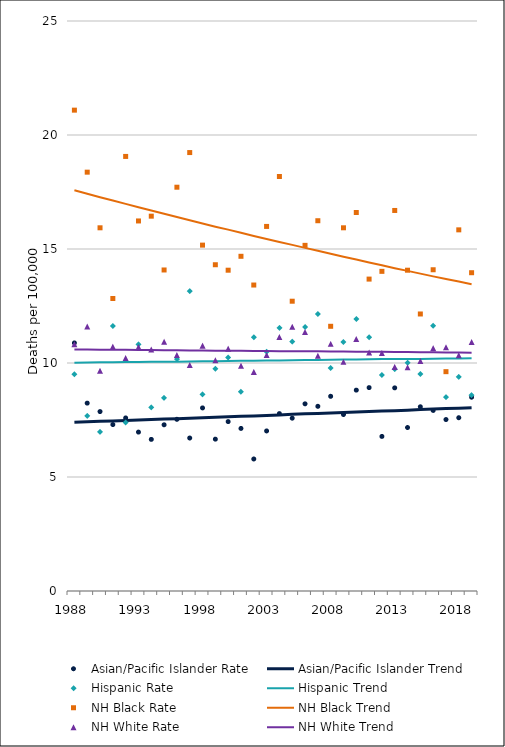
| Category | Asian/Pacific Islander Rate | Asian/Pacific Islander Trend | Hispanic Rate | Hispanic Trend | NH Black Rate | NH Black Trend | NH White Rate | NH White Trend |
|---|---|---|---|---|---|---|---|---|
| 1988.0 | 10.88 | 7.4 | 9.51 | 10.01 | 21.09 | 17.58 | 10.82 | 10.59 |
| 1989.0 | 8.24 | 7.42 | 7.68 | 10.02 | 18.37 | 17.42 | 11.6 | 10.59 |
| 1990.0 | 7.87 | 7.44 | 6.98 | 10.03 | 15.93 | 17.27 | 9.66 | 10.58 |
| 1991.0 | 7.3 | 7.46 | 11.62 | 10.03 | 12.83 | 17.13 | 10.72 | 10.58 |
| 1992.0 | 7.59 | 7.48 | 7.39 | 10.04 | 19.06 | 16.98 | 10.22 | 10.58 |
| 1993.0 | 6.97 | 7.5 | 10.82 | 10.04 | 16.23 | 16.83 | 10.7 | 10.57 |
| 1994.0 | 6.65 | 7.52 | 8.05 | 10.05 | 16.44 | 16.69 | 10.59 | 10.57 |
| 1995.0 | 7.29 | 7.54 | 8.47 | 10.06 | 14.08 | 16.55 | 10.93 | 10.56 |
| 1996.0 | 7.53 | 7.56 | 10.17 | 10.06 | 17.71 | 16.4 | 10.35 | 10.56 |
| 1997.0 | 6.71 | 7.58 | 13.15 | 10.07 | 19.23 | 16.26 | 9.91 | 10.55 |
| 1998.0 | 8.03 | 7.6 | 8.62 | 10.08 | 15.17 | 16.12 | 10.76 | 10.55 |
| 1999.0 | 6.66 | 7.62 | 9.75 | 10.08 | 14.31 | 15.98 | 10.12 | 10.54 |
| 2000.0 | 7.43 | 7.64 | 10.24 | 10.09 | 14.07 | 15.85 | 10.63 | 10.54 |
| 2001.0 | 7.13 | 7.66 | 8.74 | 10.1 | 14.68 | 15.71 | 9.88 | 10.54 |
| 2002.0 | 5.79 | 7.68 | 11.13 | 10.1 | 13.42 | 15.57 | 9.61 | 10.53 |
| 2003.0 | 7.02 | 7.7 | 10.49 | 10.11 | 15.99 | 15.44 | 10.35 | 10.53 |
| 2004.0 | 7.78 | 7.72 | 11.54 | 10.11 | 18.18 | 15.31 | 11.14 | 10.52 |
| 2005.0 | 7.58 | 7.75 | 10.94 | 10.12 | 12.71 | 15.18 | 11.59 | 10.52 |
| 2006.0 | 8.21 | 7.77 | 11.58 | 10.13 | 15.16 | 15.05 | 11.36 | 10.51 |
| 2007.0 | 8.1 | 7.79 | 12.15 | 10.13 | 16.24 | 14.92 | 10.32 | 10.51 |
| 2008.0 | 8.54 | 7.81 | 9.78 | 10.14 | 11.61 | 14.79 | 10.84 | 10.5 |
| 2009.0 | 7.74 | 7.83 | 10.92 | 10.15 | 15.93 | 14.66 | 10.05 | 10.5 |
| 2010.0 | 8.81 | 7.85 | 11.93 | 10.15 | 16.6 | 14.54 | 11.05 | 10.49 |
| 2011.0 | 8.92 | 7.87 | 11.13 | 10.16 | 13.68 | 14.41 | 10.46 | 10.49 |
| 2012.0 | 6.78 | 7.89 | 9.47 | 10.17 | 14.02 | 14.29 | 10.44 | 10.49 |
| 2013.0 | 8.91 | 7.91 | 9.73 | 10.17 | 16.69 | 14.16 | 9.83 | 10.48 |
| 2014.0 | 7.17 | 7.93 | 10.01 | 10.18 | 14.07 | 14.04 | 9.81 | 10.48 |
| 2015.0 | 8.08 | 7.96 | 9.52 | 10.18 | 12.15 | 13.92 | 10.09 | 10.47 |
| 2016.0 | 7.92 | 7.98 | 11.63 | 10.19 | 14.09 | 13.8 | 10.65 | 10.47 |
| 2017.0 | 7.52 | 8 | 8.5 | 10.2 | 9.62 | 13.68 | 10.69 | 10.46 |
| 2018.0 | 7.6 | 8.02 | 9.39 | 10.2 | 15.84 | 13.57 | 10.34 | 10.46 |
| 2019.0 | 8.5 | 8.04 | 8.59 | 10.21 | 13.96 | 13.45 | 10.92 | 10.45 |